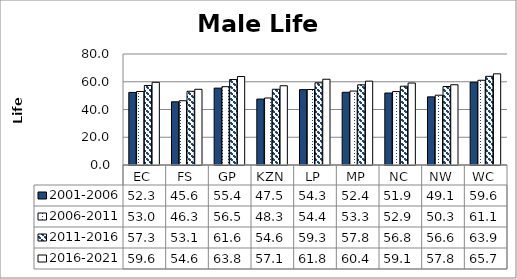
| Category | 2001-2006 | 2006-2011 | 2011-2016 | 2016-2021 |
|---|---|---|---|---|
| EC | 52.308 | 53.003 | 57.323 | 59.603 |
| FS | 45.558 | 46.327 | 53.149 | 54.568 |
| GP | 55.413 | 56.45 | 61.598 | 63.768 |
| KZN | 47.512 | 48.282 | 54.582 | 57.109 |
| LP | 54.308 | 54.431 | 59.256 | 61.807 |
| MP | 52.401 | 53.298 | 57.81 | 60.437 |
| NC | 51.866 | 52.912 | 56.811 | 59.084 |
| NW | 49.114 | 50.306 | 56.565 | 57.832 |
| WC | 59.618 | 61.06 | 63.929 | 65.699 |